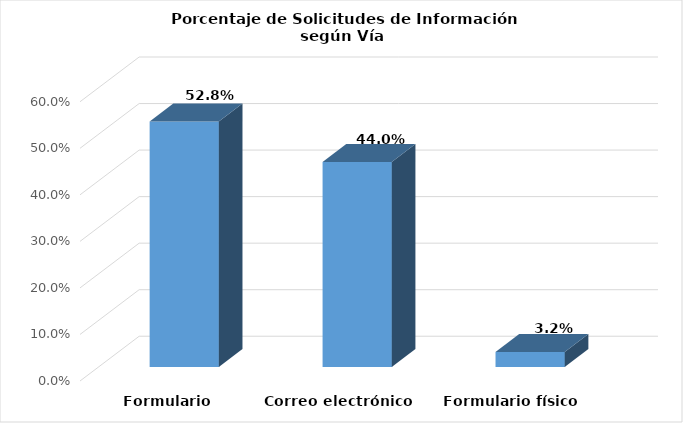
| Category | Series 0 |
|---|---|
| Formulario electrónico SAIP | 0.528 |
| Correo electrónico | 0.44 |
| Formulario físico | 0.032 |